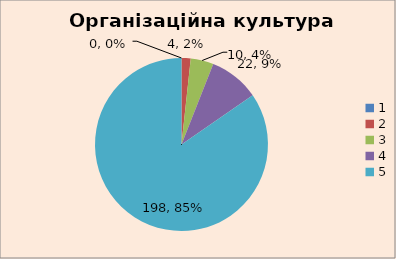
| Category | Кількість | % |
|---|---|---|
| 0 | 0 | 0 |
| 1 | 4 | 0.017 |
| 2 | 10 | 0.043 |
| 3 | 22 | 0.094 |
| 4 | 198 | 0.846 |